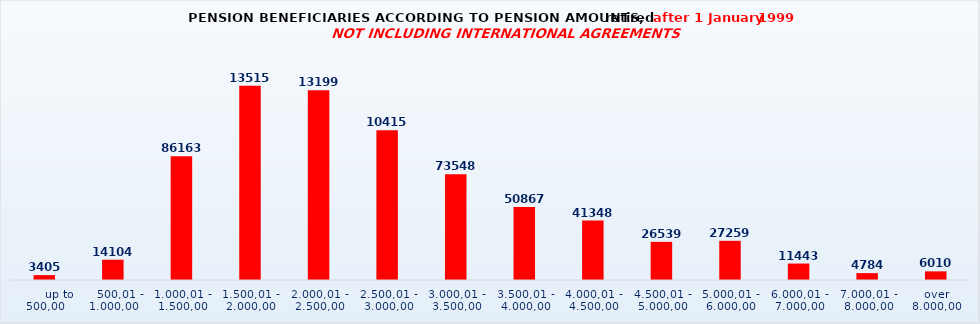
| Category | Series 0 |
|---|---|
|       up to 500,00 | 3405 |
|    500,01 - 1.000,00 | 14104 |
| 1.000,01 - 1.500,00 | 86163 |
| 1.500,01 - 2.000,00 | 135156 |
| 2.000,01 - 2.500,00 | 131998 |
| 2.500,01 - 3.000,00 | 104152 |
| 3.000,01 - 3.500,00 | 73548 |
| 3.500,01 - 4.000,00 | 50867 |
| 4.000,01 - 4.500,00 | 41348 |
| 4.500,01 - 5.000,00 | 26539 |
| 5.000,01 - 6.000,00 | 27259 |
| 6.000,01 - 7.000,00 | 11443 |
| 7.000,01 - 8.000,00 | 4784 |
| over 8.000,00 | 6010 |